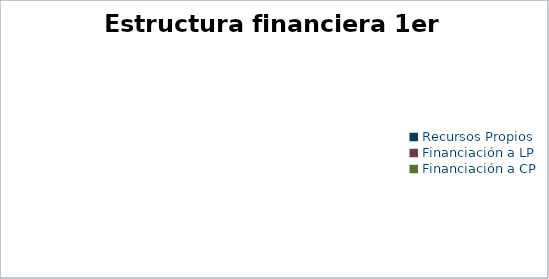
| Category | Series 0 |
|---|---|
| Recursos Propios | 0 |
| Financiación a LP | 0 |
| Financiación a CP | 0 |